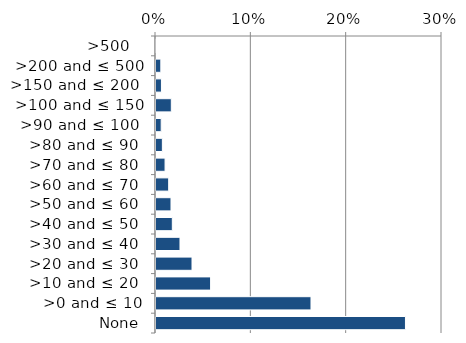
| Category | Non native |
|---|---|
|  None | 0.263 |
| >0 and ≤ 10 | 0.164 |
| >10 and ≤ 20  | 0.058 |
| >20 and ≤ 30  | 0.039 |
| >30 and ≤ 40  | 0.026 |
| >40 and ≤ 50  | 0.018 |
| >50 and ≤ 60  | 0.017 |
| >60 and ≤ 70  | 0.014 |
| >70 and ≤ 80  | 0.011 |
| >80 and ≤ 90  | 0.008 |
| >90 and ≤ 100  | 0.007 |
| >100 and ≤ 150 | 0.017 |
| >150 and ≤ 200  | 0.007 |
| >200 and ≤ 500 | 0.006 |
| >500   | 0 |